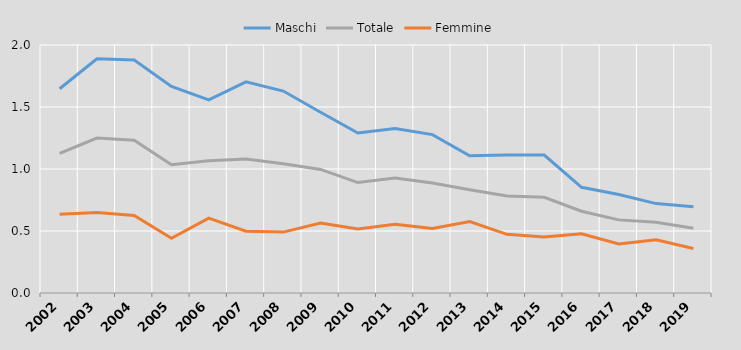
| Category | Maschi | Totale | Femmine |
|---|---|---|---|
| 2002.0 | 1.647 | 1.125 | 0.635 |
| 2003.0 | 1.888 | 1.249 | 0.65 |
| 2004.0 | 1.879 | 1.233 | 0.625 |
| 2005.0 | 1.666 | 1.035 | 0.442 |
| 2006.0 | 1.558 | 1.066 | 0.604 |
| 2007.0 | 1.702 | 1.081 | 0.498 |
| 2008.0 | 1.629 | 1.042 | 0.491 |
| 2009.0 | 1.458 | 0.997 | 0.564 |
| 2010.0 | 1.29 | 0.891 | 0.516 |
| 2011.0 | 1.327 | 0.928 | 0.554 |
| 2012.0 | 1.277 | 0.887 | 0.521 |
| 2013.0 | 1.107 | 0.833 | 0.577 |
| 2014.0 | 1.112 | 0.783 | 0.473 |
| 2015.0 | 1.113 | 0.772 | 0.451 |
| 2016.0 | 0.852 | 0.66 | 0.478 |
| 2017.0 | 0.795 | 0.59 | 0.395 |
| 2018.0 | 0.721 | 0.571 | 0.429 |
| 2019.0 | 0.695 | 0.522 | 0.359 |